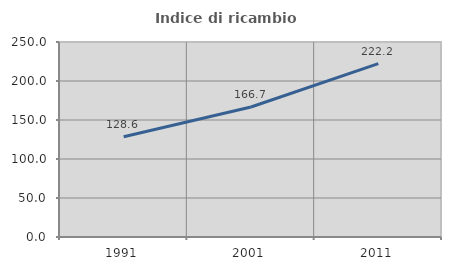
| Category | Indice di ricambio occupazionale  |
|---|---|
| 1991.0 | 128.571 |
| 2001.0 | 166.667 |
| 2011.0 | 222.222 |